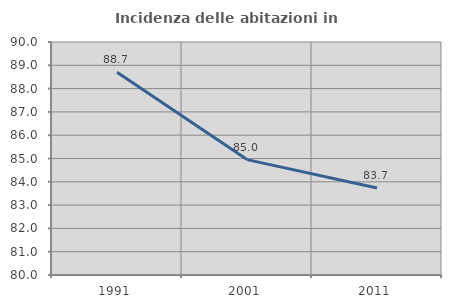
| Category | Incidenza delle abitazioni in proprietà  |
|---|---|
| 1991.0 | 88.702 |
| 2001.0 | 84.953 |
| 2011.0 | 83.734 |